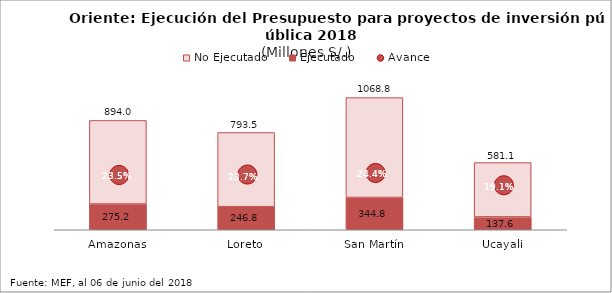
| Category | Ejecutado | No Ejecutado |
|---|---|---|
| Amazonas | 275.249 | 894.025 |
| Loreto | 246.795 | 793.511 |
| San Martín | 344.759 | 1068.838 |
| Ucayali | 137.584 | 581.125 |